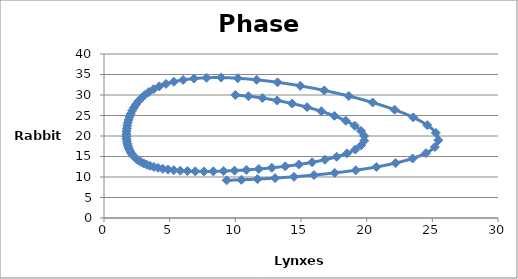
| Category | Series 0 |
|---|---|
| 10.0 | 30 |
| 11.0 | 29.7 |
| 12.067 | 29.255 |
| 13.183740515 | 28.66 |
| 14.325400993062862 | 27.917 |
| 15.459512883659952 | 27.034 |
| 16.546914209959233 | 26.026 |
| 17.54395978665699 | 24.913 |
| 18.405960595860087 | 23.725 |
| 19.09149340463428 | 22.49 |
| 19.566897057134206 | 21.243 |
| 19.810091586937276 | 20.014 |
| 19.81292761825478 | 18.832 |
| 19.581604072881216 | 17.72 |
| 19.13516876747917 | 16.694 |
| 18.502558450745077 | 15.765 |
| 17.718889874419894 | 14.937 |
| 16.821729217338106 | 14.211 |
| 15.847895546959327 | 13.584 |
| 14.831100429332626 | 13.051 |
| 13.800488219190777 | 12.605 |
| 12.779975620865034 | 12.24 |
| 11.78820605736975 | 11.947 |
| 10.838917571670072 | 11.721 |
| 9.941546522506359 | 11.554 |
| 9.10193023277093 | 11.442 |
| 8.323014561995251 | 11.379 |
| 7.605509053444207 | 11.361 |
| 6.948460068982602 | 11.383 |
| 6.349731396902955 | 11.443 |
| 5.8063937488413355 | 11.538 |
| 5.31503121528355 | 11.664 |
| 4.871975807352558 | 11.821 |
| 4.47348199999055 | 12.006 |
| 4.115852663453747 | 12.217 |
| 3.79552657009283 | 12.455 |
| 3.5091361998114596 | 12.716 |
| 3.2535430822110456 | 13.002 |
| 3.0258565371373307 | 13.31 |
| 2.8234404686813823 | 13.641 |
| 2.6439118489286058 | 13.995 |
| 2.485133691489295 | 14.369 |
| 2.3452046437939464 | 14.766 |
| 2.222446799291419 | 15.183 |
| 2.1153929234591304 | 15.622 |
| 2.0227739799550637 | 16.081 |
| 1.9435076169967458 | 16.562 |
| 1.8766881138224545 | 17.063 |
| 1.8215781805141313 | 17.586 |
| 1.7776029419157218 | 18.129 |
| 1.7443464106771593 | 18.693 |
| 1.7215507605229705 | 19.278 |
| 1.7091187454200094 | 19.883 |
| 1.7071196716299797 | 20.508 |
| 1.715799417069925 | 21.154 |
| 1.735595106115324 | 21.818 |
| 1.7671551883074996 | 22.502 |
| 1.8113658360512959 | 23.203 |
| 1.8693847669778023 | 23.921 |
| 1.9426838046802064 | 24.654 |
| 2.033101702826973 | 25.401 |
| 2.1429089448842253 | 26.159 |
| 2.2748863458312485 | 26.925 |
| 2.432419239669667 | 27.696 |
| 2.6196086996487087 | 28.467 |
| 2.8414003879036027 | 29.232 |
| 3.1037299293788756 | 29.986 |
| 3.413680646206931 | 30.721 |
| 3.7796443478555393 | 31.425 |
| 4.211467662169899 | 32.088 |
| 4.720553871946292 | 32.696 |
| 5.319872034106321 | 33.232 |
| 6.023800244761075 | 33.677 |
| 6.847698434255361 | 34.01 |
| 7.807071153080232 | 34.206 |
| 8.916151349765412 | 34.239 |
| 10.185730605701067 | 34.082 |
| 11.620111059065323 | 33.71 |
| 13.213202819720504 | 33.1 |
| 14.944081531109099 | 32.237 |
| 16.77276488700982 | 31.118 |
| 18.63748773019053 | 29.753 |
| 20.45513266613781 | 28.17 |
| 22.12635021920093 | 26.416 |
| 23.54594295788352 | 24.55 |
| 24.617294972929344 | 22.642 |
| 25.267629989044313 | 20.761 |
| 25.45980426605359 | 18.968 |
| 25.197091492235934 | 17.312 |
| 24.51985120681998 | 15.824 |
| 23.495811119947945 | 14.517 |
| 22.20744381568892 | 13.392 |
| 20.739948258915412 | 12.441 |
| 19.17212303204556 | 11.648 |
| 17.57088529179864 | 10.997 |
| 15.989053002742649 | 10.471 |
| 14.465479910405005 | 10.053 |
| 13.02658066418416 | 9.728 |
| 11.688476296279337 | 9.483 |
| 10.459246270383755 | 9.309 |
| 9.34099656264566 | 9.194 |